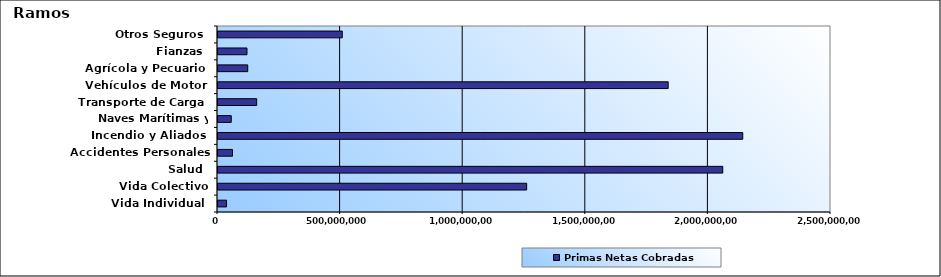
| Category | Primas Netas Cobradas |
|---|---|
| Vida Individual  | 34908109.46 |
| Vida Colectivo | 1258869280.22 |
| Salud  | 2058586025.5 |
| Accidentes Personales | 59088397.52 |
| Incendio y Aliados  | 2140195277.87 |
| Naves Marítimas y Aéreas  | 54096328.65 |
| Transporte de Carga  | 157735415 |
| Vehículos de Motor  | 1836042532.12 |
| Agrícola y Pecuario  | 121288450.16 |
| Fianzas  | 118162702.89 |
| Otros Seguros  | 506808819.82 |